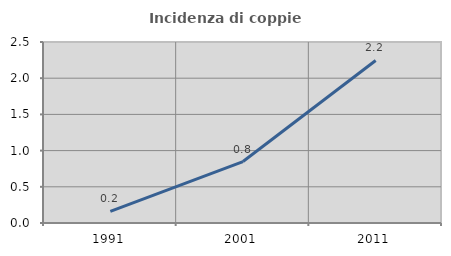
| Category | Incidenza di coppie miste |
|---|---|
| 1991.0 | 0.161 |
| 2001.0 | 0.849 |
| 2011.0 | 2.245 |